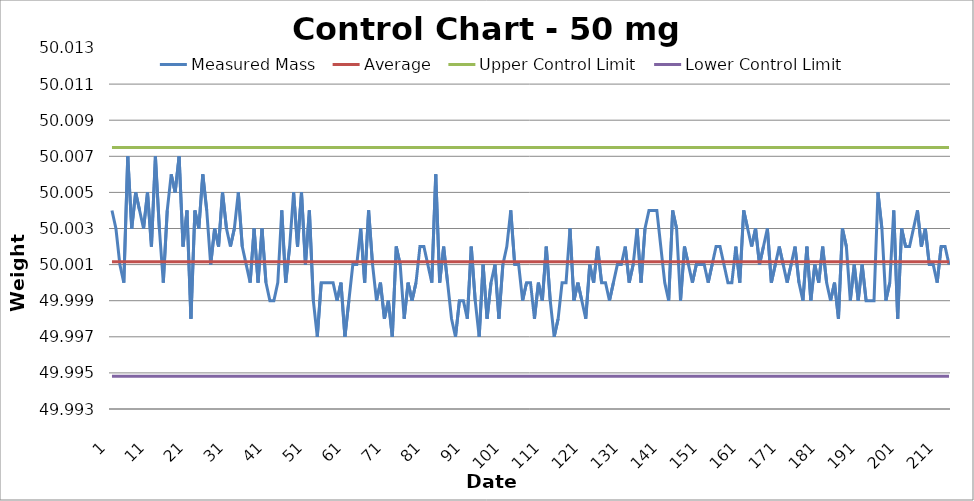
| Category | Measured Mass | Average | Upper Control Limit | Lower Control Limit |
|---|---|---|---|---|
| 1.0 | 50.004 | 50.001 | 50.007 | 49.995 |
| 2.0 | 50.003 | 50.001 | 50.007 | 49.995 |
| 3.0 | 50.001 | 50.001 | 50.007 | 49.995 |
| 4.0 | 50 | 50.001 | 50.007 | 49.995 |
| 5.0 | 50.007 | 50.001 | 50.007 | 49.995 |
| 6.0 | 50.003 | 50.001 | 50.007 | 49.995 |
| 7.0 | 50.005 | 50.001 | 50.007 | 49.995 |
| 8.0 | 50.004 | 50.001 | 50.007 | 49.995 |
| 9.0 | 50.003 | 50.001 | 50.007 | 49.995 |
| 10.0 | 50.005 | 50.001 | 50.007 | 49.995 |
| 11.0 | 50.002 | 50.001 | 50.007 | 49.995 |
| 12.0 | 50.007 | 50.001 | 50.007 | 49.995 |
| 13.0 | 50.003 | 50.001 | 50.007 | 49.995 |
| 14.0 | 50 | 50.001 | 50.007 | 49.995 |
| 15.0 | 50.004 | 50.001 | 50.007 | 49.995 |
| 16.0 | 50.006 | 50.001 | 50.007 | 49.995 |
| 17.0 | 50.005 | 50.001 | 50.007 | 49.995 |
| 18.0 | 50.007 | 50.001 | 50.007 | 49.995 |
| 19.0 | 50.002 | 50.001 | 50.007 | 49.995 |
| 20.0 | 50.004 | 50.001 | 50.007 | 49.995 |
| 21.0 | 49.998 | 50.001 | 50.007 | 49.995 |
| 22.0 | 50.004 | 50.001 | 50.007 | 49.995 |
| 23.0 | 50.003 | 50.001 | 50.007 | 49.995 |
| 24.0 | 50.006 | 50.001 | 50.007 | 49.995 |
| 25.0 | 50.004 | 50.001 | 50.007 | 49.995 |
| 26.0 | 50.001 | 50.001 | 50.007 | 49.995 |
| 27.0 | 50.003 | 50.001 | 50.007 | 49.995 |
| 28.0 | 50.002 | 50.001 | 50.007 | 49.995 |
| 29.0 | 50.005 | 50.001 | 50.007 | 49.995 |
| 30.0 | 50.003 | 50.001 | 50.007 | 49.995 |
| 31.0 | 50.002 | 50.001 | 50.007 | 49.995 |
| 32.0 | 50.003 | 50.001 | 50.007 | 49.995 |
| 33.0 | 50.005 | 50.001 | 50.007 | 49.995 |
| 34.0 | 50.002 | 50.001 | 50.007 | 49.995 |
| 35.0 | 50.001 | 50.001 | 50.007 | 49.995 |
| 36.0 | 50 | 50.001 | 50.007 | 49.995 |
| 37.0 | 50.003 | 50.001 | 50.007 | 49.995 |
| 38.0 | 50 | 50.001 | 50.007 | 49.995 |
| 39.0 | 50.003 | 50.001 | 50.007 | 49.995 |
| 40.0 | 50 | 50.001 | 50.007 | 49.995 |
| 41.0 | 49.999 | 50.001 | 50.007 | 49.995 |
| 42.0 | 49.999 | 50.001 | 50.007 | 49.995 |
| 43.0 | 50 | 50.001 | 50.007 | 49.995 |
| 44.0 | 50.004 | 50.001 | 50.007 | 49.995 |
| 45.0 | 50 | 50.001 | 50.007 | 49.995 |
| 46.0 | 50.002 | 50.001 | 50.007 | 49.995 |
| 47.0 | 50.005 | 50.001 | 50.007 | 49.995 |
| 48.0 | 50.002 | 50.001 | 50.007 | 49.995 |
| 49.0 | 50.005 | 50.001 | 50.007 | 49.995 |
| 50.0 | 50.001 | 50.001 | 50.007 | 49.995 |
| 51.0 | 50.004 | 50.001 | 50.007 | 49.995 |
| 52.0 | 49.999 | 50.001 | 50.007 | 49.995 |
| 53.0 | 49.997 | 50.001 | 50.007 | 49.995 |
| 54.0 | 50 | 50.001 | 50.007 | 49.995 |
| 55.0 | 50 | 50.001 | 50.007 | 49.995 |
| 56.0 | 50 | 50.001 | 50.007 | 49.995 |
| 57.0 | 50 | 50.001 | 50.007 | 49.995 |
| 58.0 | 49.999 | 50.001 | 50.007 | 49.995 |
| 59.0 | 50 | 50.001 | 50.007 | 49.995 |
| 60.0 | 49.997 | 50.001 | 50.007 | 49.995 |
| 61.0 | 49.999 | 50.001 | 50.007 | 49.995 |
| 62.0 | 50.001 | 50.001 | 50.007 | 49.995 |
| 63.0 | 50.001 | 50.001 | 50.007 | 49.995 |
| 64.0 | 50.003 | 50.001 | 50.007 | 49.995 |
| 65.0 | 50 | 50.001 | 50.007 | 49.995 |
| 66.0 | 50.004 | 50.001 | 50.007 | 49.995 |
| 67.0 | 50.001 | 50.001 | 50.007 | 49.995 |
| 68.0 | 49.999 | 50.001 | 50.007 | 49.995 |
| 69.0 | 50 | 50.001 | 50.007 | 49.995 |
| 70.0 | 49.998 | 50.001 | 50.007 | 49.995 |
| 71.0 | 49.999 | 50.001 | 50.007 | 49.995 |
| 72.0 | 49.997 | 50.001 | 50.007 | 49.995 |
| 73.0 | 50.002 | 50.001 | 50.007 | 49.995 |
| 74.0 | 50.001 | 50.001 | 50.007 | 49.995 |
| 75.0 | 49.998 | 50.001 | 50.007 | 49.995 |
| 76.0 | 50 | 50.001 | 50.007 | 49.995 |
| 77.0 | 49.999 | 50.001 | 50.007 | 49.995 |
| 78.0 | 50 | 50.001 | 50.007 | 49.995 |
| 79.0 | 50.002 | 50.001 | 50.007 | 49.995 |
| 80.0 | 50.002 | 50.001 | 50.007 | 49.995 |
| 81.0 | 50.001 | 50.001 | 50.007 | 49.995 |
| 82.0 | 50 | 50.001 | 50.007 | 49.995 |
| 83.0 | 50.006 | 50.001 | 50.007 | 49.995 |
| 84.0 | 50 | 50.001 | 50.007 | 49.995 |
| 85.0 | 50.002 | 50.001 | 50.007 | 49.995 |
| 86.0 | 50 | 50.001 | 50.007 | 49.995 |
| 87.0 | 49.998 | 50.001 | 50.007 | 49.995 |
| 88.0 | 49.997 | 50.001 | 50.007 | 49.995 |
| 89.0 | 49.999 | 50.001 | 50.007 | 49.995 |
| 90.0 | 49.999 | 50.001 | 50.007 | 49.995 |
| 91.0 | 49.998 | 50.001 | 50.007 | 49.995 |
| 92.0 | 50.002 | 50.001 | 50.007 | 49.995 |
| 93.0 | 49.999 | 50.001 | 50.007 | 49.995 |
| 94.0 | 49.997 | 50.001 | 50.007 | 49.995 |
| 95.0 | 50.001 | 50.001 | 50.007 | 49.995 |
| 96.0 | 49.998 | 50.001 | 50.007 | 49.995 |
| 97.0 | 50 | 50.001 | 50.007 | 49.995 |
| 98.0 | 50.001 | 50.001 | 50.007 | 49.995 |
| 99.0 | 49.998 | 50.001 | 50.007 | 49.995 |
| 100.0 | 50.001 | 50.001 | 50.007 | 49.995 |
| 101.0 | 50.002 | 50.001 | 50.007 | 49.995 |
| 102.0 | 50.004 | 50.001 | 50.007 | 49.995 |
| 103.0 | 50.001 | 50.001 | 50.007 | 49.995 |
| 104.0 | 50.001 | 50.001 | 50.007 | 49.995 |
| 105.0 | 49.999 | 50.001 | 50.007 | 49.995 |
| 106.0 | 50 | 50.001 | 50.007 | 49.995 |
| 107.0 | 50 | 50.001 | 50.007 | 49.995 |
| 108.0 | 49.998 | 50.001 | 50.007 | 49.995 |
| 109.0 | 50 | 50.001 | 50.007 | 49.995 |
| 110.0 | 49.999 | 50.001 | 50.007 | 49.995 |
| 111.0 | 50.002 | 50.001 | 50.007 | 49.995 |
| 112.0 | 49.999 | 50.001 | 50.007 | 49.995 |
| 113.0 | 49.997 | 50.001 | 50.007 | 49.995 |
| 114.0 | 49.998 | 50.001 | 50.007 | 49.995 |
| 115.0 | 50 | 50.001 | 50.007 | 49.995 |
| 116.0 | 50 | 50.001 | 50.007 | 49.995 |
| 117.0 | 50.003 | 50.001 | 50.007 | 49.995 |
| 118.0 | 49.999 | 50.001 | 50.007 | 49.995 |
| 119.0 | 50 | 50.001 | 50.007 | 49.995 |
| 120.0 | 49.999 | 50.001 | 50.007 | 49.995 |
| 121.0 | 49.998 | 50.001 | 50.007 | 49.995 |
| 122.0 | 50.001 | 50.001 | 50.007 | 49.995 |
| 123.0 | 50 | 50.001 | 50.007 | 49.995 |
| 124.0 | 50.002 | 50.001 | 50.007 | 49.995 |
| 125.0 | 50 | 50.001 | 50.007 | 49.995 |
| 126.0 | 50 | 50.001 | 50.007 | 49.995 |
| 127.0 | 49.999 | 50.001 | 50.007 | 49.995 |
| 128.0 | 50 | 50.001 | 50.007 | 49.995 |
| 129.0 | 50.001 | 50.001 | 50.007 | 49.995 |
| 130.0 | 50.001 | 50.001 | 50.007 | 49.995 |
| 131.0 | 50.002 | 50.001 | 50.007 | 49.995 |
| 132.0 | 50 | 50.001 | 50.007 | 49.995 |
| 133.0 | 50.001 | 50.001 | 50.007 | 49.995 |
| 134.0 | 50.003 | 50.001 | 50.007 | 49.995 |
| 135.0 | 50 | 50.001 | 50.007 | 49.995 |
| 136.0 | 50.003 | 50.001 | 50.007 | 49.995 |
| 137.0 | 50.004 | 50.001 | 50.007 | 49.995 |
| 138.0 | 50.004 | 50.001 | 50.007 | 49.995 |
| 139.0 | 50.004 | 50.001 | 50.007 | 49.995 |
| 140.0 | 50.002 | 50.001 | 50.007 | 49.995 |
| 141.0 | 50 | 50.001 | 50.007 | 49.995 |
| 142.0 | 49.999 | 50.001 | 50.007 | 49.995 |
| 143.0 | 50.004 | 50.001 | 50.007 | 49.995 |
| 144.0 | 50.003 | 50.001 | 50.007 | 49.995 |
| 145.0 | 49.999 | 50.001 | 50.007 | 49.995 |
| 146.0 | 50.002 | 50.001 | 50.007 | 49.995 |
| 147.0 | 50.001 | 50.001 | 50.007 | 49.995 |
| 148.0 | 50 | 50.001 | 50.007 | 49.995 |
| 149.0 | 50.001 | 50.001 | 50.007 | 49.995 |
| 150.0 | 50.001 | 50.001 | 50.007 | 49.995 |
| 151.0 | 50.001 | 50.001 | 50.007 | 49.995 |
| 152.0 | 50 | 50.001 | 50.007 | 49.995 |
| 153.0 | 50.001 | 50.001 | 50.007 | 49.995 |
| 154.0 | 50.002 | 50.001 | 50.007 | 49.995 |
| 155.0 | 50.002 | 50.001 | 50.007 | 49.995 |
| 156.0 | 50.001 | 50.001 | 50.007 | 49.995 |
| 157.0 | 50 | 50.001 | 50.007 | 49.995 |
| 158.0 | 50 | 50.001 | 50.007 | 49.995 |
| 159.0 | 50.002 | 50.001 | 50.007 | 49.995 |
| 160.0 | 50 | 50.001 | 50.007 | 49.995 |
| 161.0 | 50.004 | 50.001 | 50.007 | 49.995 |
| 162.0 | 50.003 | 50.001 | 50.007 | 49.995 |
| 163.0 | 50.002 | 50.001 | 50.007 | 49.995 |
| 164.0 | 50.003 | 50.001 | 50.007 | 49.995 |
| 165.0 | 50.001 | 50.001 | 50.007 | 49.995 |
| 166.0 | 50.002 | 50.001 | 50.007 | 49.995 |
| 167.0 | 50.003 | 50.001 | 50.007 | 49.995 |
| 168.0 | 50 | 50.001 | 50.007 | 49.995 |
| 169.0 | 50.001 | 50.001 | 50.007 | 49.995 |
| 170.0 | 50.002 | 50.001 | 50.007 | 49.995 |
| 171.0 | 50.001 | 50.001 | 50.007 | 49.995 |
| 172.0 | 50 | 50.001 | 50.007 | 49.995 |
| 173.0 | 50.001 | 50.001 | 50.007 | 49.995 |
| 174.0 | 50.002 | 50.001 | 50.007 | 49.995 |
| 175.0 | 50 | 50.001 | 50.007 | 49.995 |
| 176.0 | 49.999 | 50.001 | 50.007 | 49.995 |
| 177.0 | 50.002 | 50.001 | 50.007 | 49.995 |
| 178.0 | 49.999 | 50.001 | 50.007 | 49.995 |
| 179.0 | 50.001 | 50.001 | 50.007 | 49.995 |
| 180.0 | 50 | 50.001 | 50.007 | 49.995 |
| 181.0 | 50.002 | 50.001 | 50.007 | 49.995 |
| 182.0 | 50 | 50.001 | 50.007 | 49.995 |
| 183.0 | 49.999 | 50.001 | 50.007 | 49.995 |
| 184.0 | 50 | 50.001 | 50.007 | 49.995 |
| 185.0 | 49.998 | 50.001 | 50.007 | 49.995 |
| 186.0 | 50.003 | 50.001 | 50.007 | 49.995 |
| 187.0 | 50.002 | 50.001 | 50.007 | 49.995 |
| 188.0 | 49.999 | 50.001 | 50.007 | 49.995 |
| 189.0 | 50.001 | 50.001 | 50.007 | 49.995 |
| 190.0 | 49.999 | 50.001 | 50.007 | 49.995 |
| 191.0 | 50.001 | 50.001 | 50.007 | 49.995 |
| 192.0 | 49.999 | 50.001 | 50.007 | 49.995 |
| 193.0 | 49.999 | 50.001 | 50.007 | 49.995 |
| 194.0 | 49.999 | 50.001 | 50.007 | 49.995 |
| 195.0 | 50.005 | 50.001 | 50.007 | 49.995 |
| 196.0 | 50.003 | 50.001 | 50.007 | 49.995 |
| 197.0 | 49.999 | 50.001 | 50.007 | 49.995 |
| 198.0 | 50 | 50.001 | 50.007 | 49.995 |
| 199.0 | 50.004 | 50.001 | 50.007 | 49.995 |
| 200.0 | 49.998 | 50.001 | 50.007 | 49.995 |
| 201.0 | 50.003 | 50.001 | 50.007 | 49.995 |
| 202.0 | 50.002 | 50.001 | 50.007 | 49.995 |
| 203.0 | 50.002 | 50.001 | 50.007 | 49.995 |
| 204.0 | 50.003 | 50.001 | 50.007 | 49.995 |
| 205.0 | 50.004 | 50.001 | 50.007 | 49.995 |
| 206.0 | 50.002 | 50.001 | 50.007 | 49.995 |
| 207.0 | 50.003 | 50.001 | 50.007 | 49.995 |
| 208.0 | 50.001 | 50.001 | 50.007 | 49.995 |
| 209.0 | 50.001 | 50.001 | 50.007 | 49.995 |
| 210.0 | 50 | 50.001 | 50.007 | 49.995 |
| 211.0 | 50.002 | 50.001 | 50.007 | 49.995 |
| 212.0 | 50.002 | 50.001 | 50.007 | 49.995 |
| 213.0 | 50.001 | 50.001 | 50.007 | 49.995 |